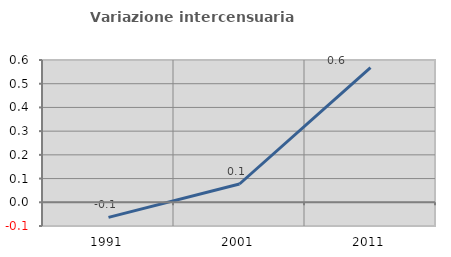
| Category | Variazione intercensuaria annua |
|---|---|
| 1991.0 | -0.064 |
| 2001.0 | 0.077 |
| 2011.0 | 0.568 |